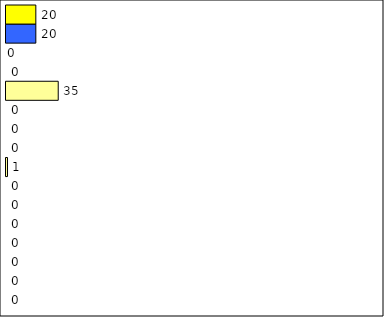
| Category | -2 | -1 | 0 | 1 | 2 | 3 | 4 | 5 | 6 | 7 | 8 | 9 | 10 | 11 | 12 | Perfect Round |
|---|---|---|---|---|---|---|---|---|---|---|---|---|---|---|---|---|
| 0 | 0 | 0 | 0 | 0 | 0 | 0 | 0 | 1 | 0 | 0 | 0 | 35 | 0 | 0 | 20 | 20 |